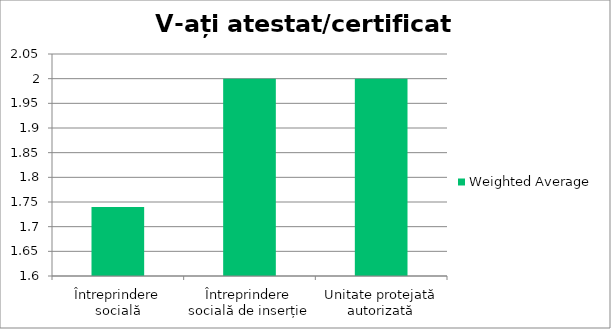
| Category | Weighted Average |
|---|---|
| Întreprindere socială | 1.74 |
| Întreprindere socială de inserție | 2 |
| Unitate protejată autorizată | 2 |